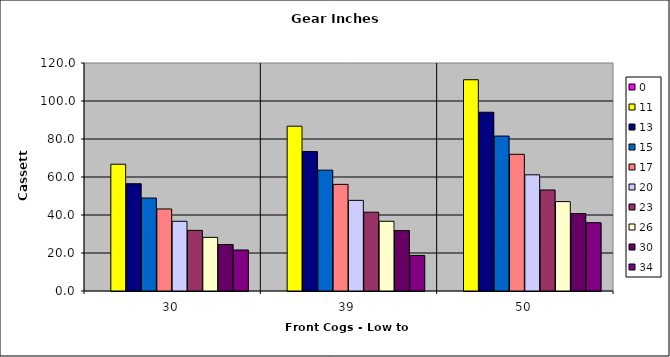
| Category | 0 | 11 | 13 | 15 | 17 | 20 | 23 | 26 | 30 | 34 |
|---|---|---|---|---|---|---|---|---|---|---|
| 30.0 | 0 | 66.715 | 56.451 | 48.924 | 43.169 | 36.693 | 31.907 | 28.226 | 24.462 | 21.584 |
| 39.0 | 0 | 86.73 | 73.387 | 63.602 | 56.119 | 47.701 | 41.479 | 36.693 | 31.801 | 18.706 |
| 50.0 | 0 | 111.192 | 94.086 | 81.541 | 71.948 | 61.156 | 53.179 | 47.043 | 40.77 | 35.974 |